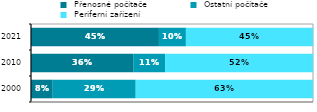
| Category |  Přenosné počítače |  Ostatní počítače |  Periferní zařízení |
|---|---|---|---|
| 2000 | 0.077 | 0.294 | 0.629 |
| 2010 | 0.364 | 0.112 | 0.524 |
| 2021 | 0.454 | 0.096 | 0.451 |